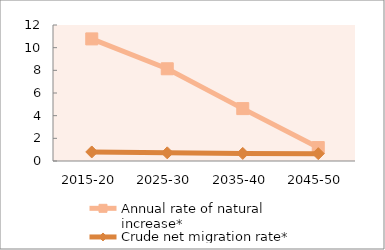
| Category | Annual rate of natural increase* | Crude net migration rate* |
|---|---|---|
| 2015-20 | 10.774 | 0.798 |
| 2025-30 | 8.137 | 0.72 |
| 2035-40 | 4.624 | 0.671 |
| 2045-50 | 1.183 | 0.648 |